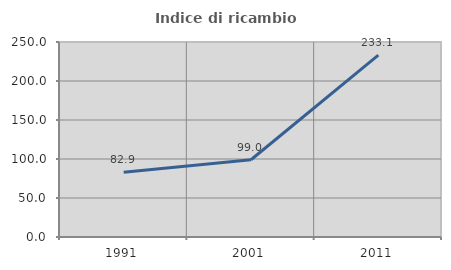
| Category | Indice di ricambio occupazionale  |
|---|---|
| 1991.0 | 82.888 |
| 2001.0 | 99.034 |
| 2011.0 | 233.083 |